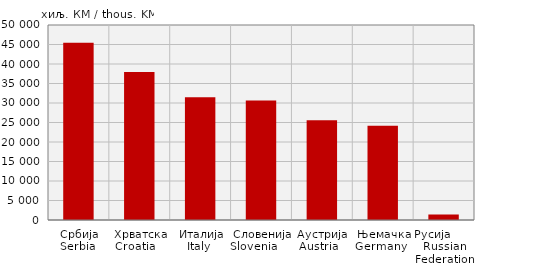
| Category | Извоз
Export |
|---|---|
| Србија
Serbia  | 45445 |
| Хрватска
Croatia    | 37977 |
| Италија
Italy  | 31504 |
| Словенија
Slovenia            | 30632 |
| Аустрија
Austria   | 25551 |
| Њемачка
Germany   | 24189 |
| Русија        Russian Federation | 1411 |